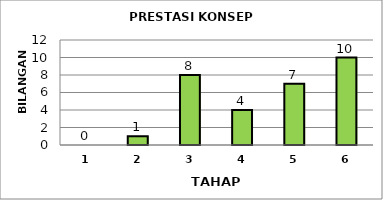
| Category | Series 0 |
|---|---|
| 1.0 | 0 |
| 2.0 | 1 |
| 3.0 | 8 |
| 4.0 | 4 |
| 5.0 | 7 |
| 6.0 | 10 |